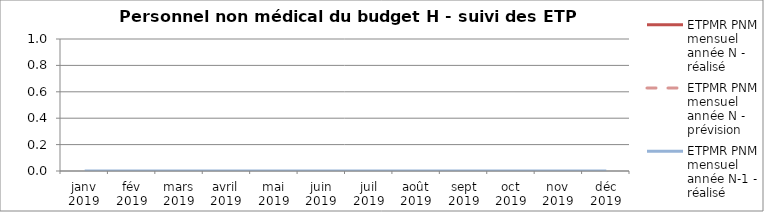
| Category | ETPMR PNM mensuel année N - réalisé | ETPMR PNM mensuel année N - prévision | ETPMR PNM mensuel année N-1 - réalisé |
|---|---|---|---|
| janv 2019 |  |  | 0 |
| fév 2019 |  |  | 0 |
| mars 2019 |  |  | 0 |
| avril 2019 |  |  | 0 |
| mai 2019 |  |  | 0 |
| juin 2019 |  |  | 0 |
| juil 2019 |  |  | 0 |
| août 2019 |  |  | 0 |
| sept 2019 |  |  | 0 |
| oct 2019 |  |  | 0 |
| nov 2019 |  |  | 0 |
| déc 2019 |  |  | 0 |